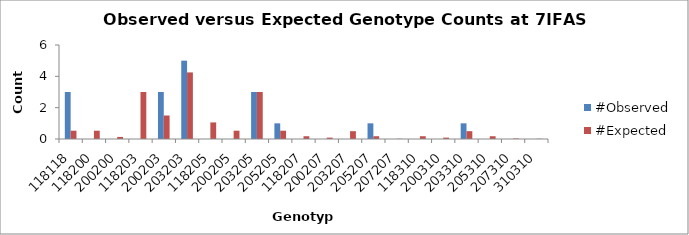
| Category | #Observed | #Expected |
|---|---|---|
| 118118.0 | 3 | 0.529 |
| 118200.0 | 0 | 0.529 |
| 200200.0 | 0 | 0.132 |
| 118203.0 | 0 | 3 |
| 200203.0 | 3 | 1.5 |
| 203203.0 | 5 | 4.25 |
| 118205.0 | 0 | 1.059 |
| 200205.0 | 0 | 0.529 |
| 203205.0 | 3 | 3 |
| 205205.0 | 1 | 0.529 |
| 118207.0 | 0 | 0.176 |
| 200207.0 | 0 | 0.088 |
| 203207.0 | 0 | 0.5 |
| 205207.0 | 1 | 0.176 |
| 207207.0 | 0 | 0.015 |
| 118310.0 | 0 | 0.176 |
| 200310.0 | 0 | 0.088 |
| 203310.0 | 1 | 0.5 |
| 205310.0 | 0 | 0.176 |
| 207310.0 | 0 | 0.029 |
| 310310.0 | 0 | 0.015 |